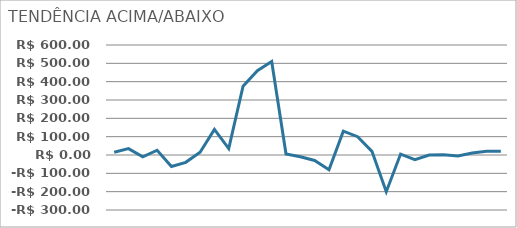
| Category | DIFERENÇA |
|---|---|
| 0 | 15 |
| 1 | 35 |
| 2 | -10 |
| 3 | 26 |
| 4 | -63 |
| 5 | -40 |
| 6 | 15 |
| 7 | 140 |
| 8 | 35 |
| 9 | 375 |
| 10 | 460 |
| 11 | 510 |
| 12 | 6 |
| 13 | -10 |
| 14 | -30 |
| 15 | -80 |
| 16 | 130 |
| 17 | 100 |
| 18 | 20 |
| 19 | -200 |
| 20 | 5 |
| 21 | -25 |
| 22 | 0 |
| 23 | 1 |
| 24 | -5 |
| 25 | 11 |
| 26 | 20 |
| 27 | 20 |